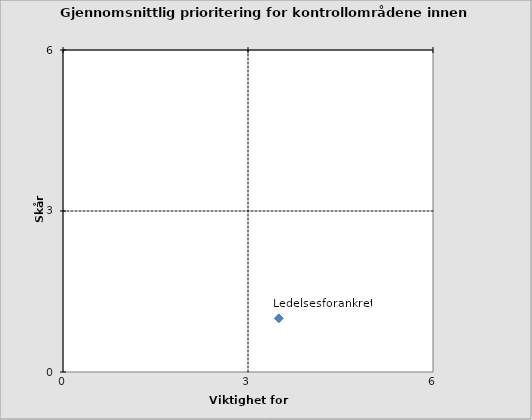
| Category | Ledelsesforankret |
|---|---|
| 3.5 | 1 |